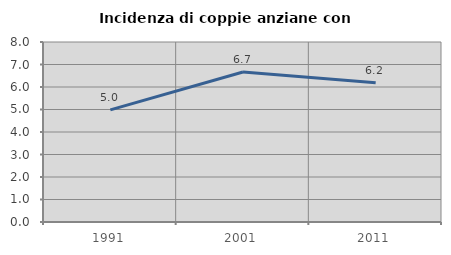
| Category | Incidenza di coppie anziane con figli |
|---|---|
| 1991.0 | 4.982 |
| 2001.0 | 6.667 |
| 2011.0 | 6.186 |